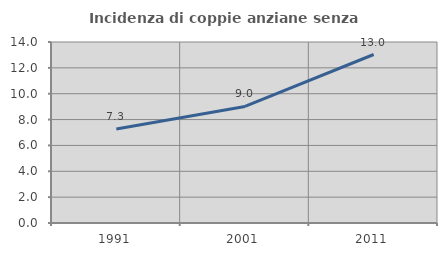
| Category | Incidenza di coppie anziane senza figli  |
|---|---|
| 1991.0 | 7.278 |
| 2001.0 | 9.019 |
| 2011.0 | 13.033 |